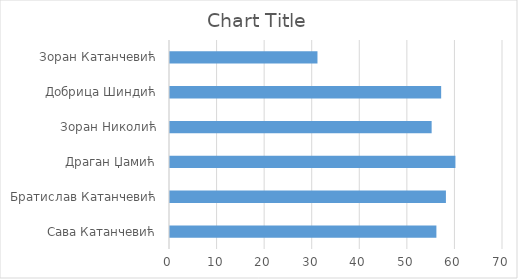
| Category | Series 0 |
|---|---|
| Сава Катанчевић | 56 |
| Братислав Катанчевић | 58 |
| Драган Џамић | 60 |
| Зоран Николић | 55 |
| Добрица Шиндић | 57 |
| Зоран Катанчевић | 31 |